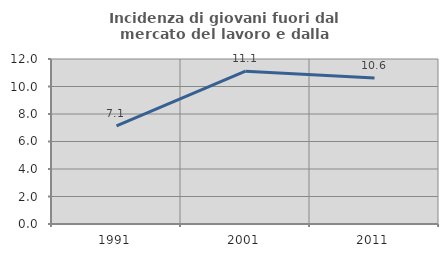
| Category | Incidenza di giovani fuori dal mercato del lavoro e dalla formazione  |
|---|---|
| 1991.0 | 7.143 |
| 2001.0 | 11.111 |
| 2011.0 | 10.619 |